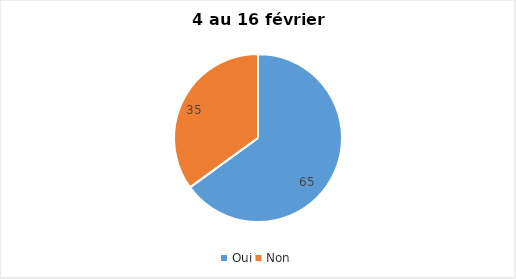
| Category | Series 0 |
|---|---|
| Oui | 65 |
| Non | 35 |